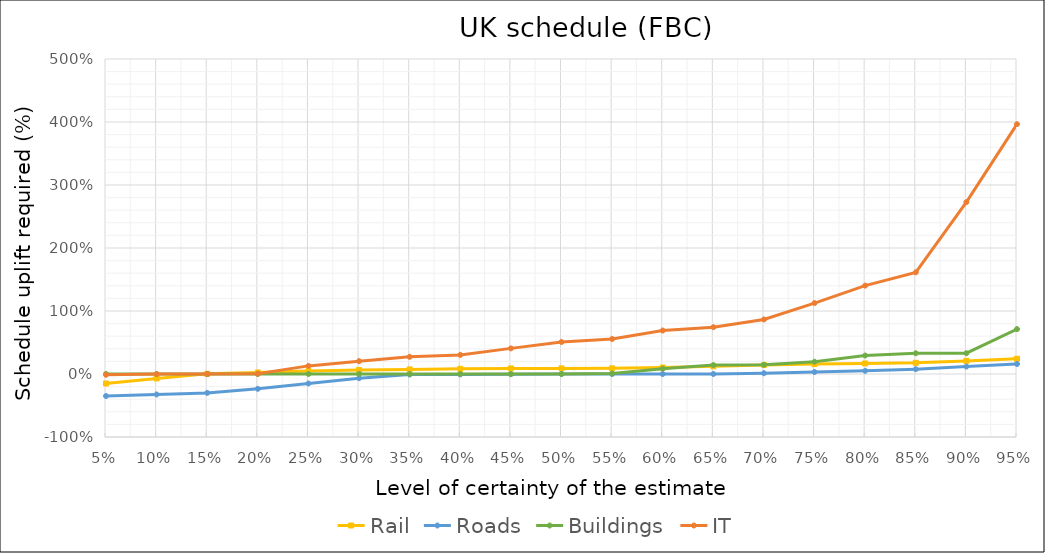
| Category | Rail | Roads | Buildings | IT |
|---|---|---|---|---|
| 0.05 | -0.151 | -0.35 | 0 | -0.012 |
| 0.1 | -0.07 | -0.325 | 0 | 0 |
| 0.15 | 0.003 | -0.3 | 0 | 0 |
| 0.2 | 0.025 | -0.235 | 0 | 0.005 |
| 0.25 | 0.046 | -0.151 | 0 | 0.129 |
| 0.3 | 0.064 | -0.066 | 0 | 0.204 |
| 0.35 | 0.073 | -0.009 | 0 | 0.273 |
| 0.4 | 0.082 | -0.006 | 0 | 0.303 |
| 0.45 | 0.088 | -0.003 | 0 | 0.407 |
| 0.5 | 0.089 | 0 | 0.001 | 0.508 |
| 0.55 | 0.09 | 0 | 0.01 | 0.556 |
| 0.6 | 0.102 | 0 | 0.085 | 0.69 |
| 0.65 | 0.123 | 0 | 0.141 | 0.743 |
| 0.7 | 0.144 | 0.013 | 0.147 | 0.866 |
| 0.75 | 0.157 | 0.032 | 0.195 | 1.126 |
| 0.8 | 0.168 | 0.05 | 0.293 | 1.403 |
| 0.85 | 0.178 | 0.077 | 0.329 | 1.614 |
| 0.9 | 0.208 | 0.118 | 0.33 | 2.728 |
| 0.95 | 0.242 | 0.159 | 0.712 | 3.965 |